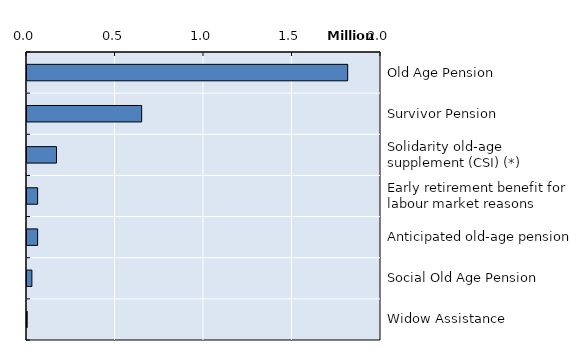
| Category | Series 0 |
|---|---|
| Old Age Pension | 1811746 |
| Survivor Pension | 647861 |
| Solidarity old-age supplement (CSI) (*) | 166626.5 |
| Early retirement benefit for labour market reasons | 60140 |
| Anticipated old-age pension | 60140 |
| Social Old Age Pension | 27662 |
| Widow Assistance | 1068 |